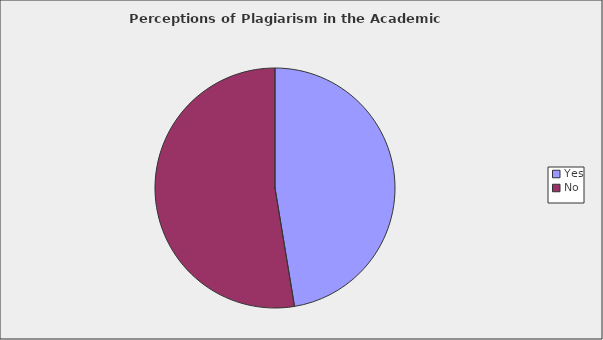
| Category | Series 0 |
|---|---|
| Yes | 0.474 |
| No | 0.526 |